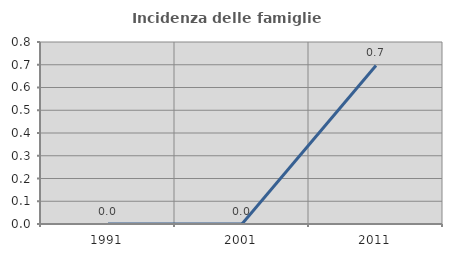
| Category | Incidenza delle famiglie numerose |
|---|---|
| 1991.0 | 0 |
| 2001.0 | 0 |
| 2011.0 | 0.697 |